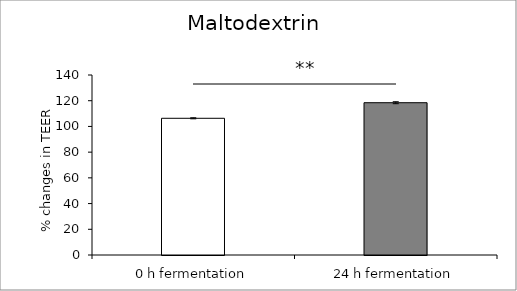
| Category | average |
|---|---|
| 0 h fermentation | 106.331 |
| 24 h fermentation | 118.446 |